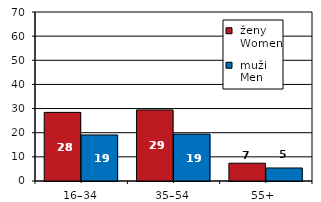
| Category |  ženy 
 Women |  muži 
 Men |
|---|---|---|
| 16–34 | 28.43 | 19.071 |
| 35–54 | 29.439 | 19.42 |
| 55+  | 7.364 | 5.391 |